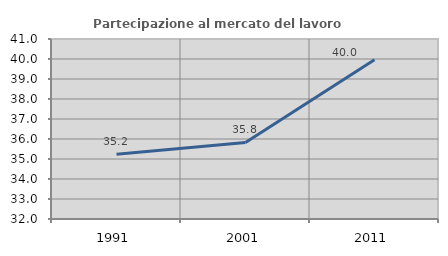
| Category | Partecipazione al mercato del lavoro  femminile |
|---|---|
| 1991.0 | 35.237 |
| 2001.0 | 35.828 |
| 2011.0 | 39.964 |